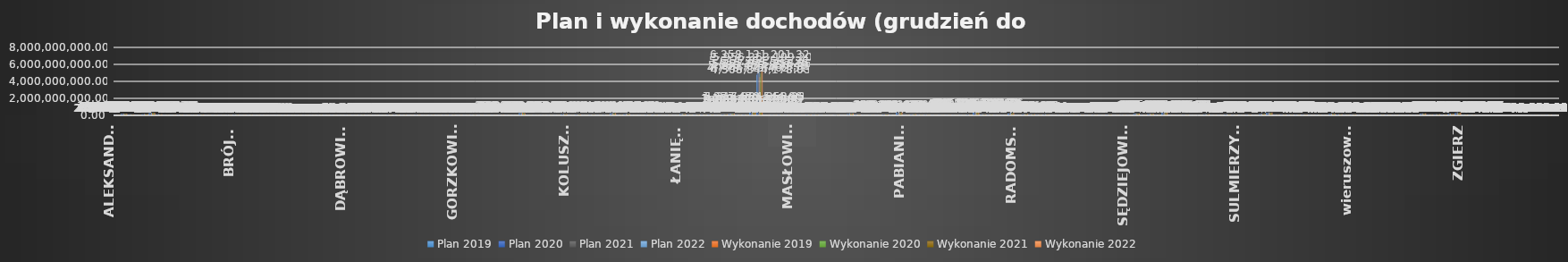
| Category | Plan 2019 | Plan 2020 | Plan 2021 | Plan 2022 | Wykonanie 2019 | Wykonanie 2020 | Series 2 | Series 3 | Series 6 | Series 7 | Wykonanie 2021 | Series 10 | Series 11 | Wykonanie 2022 |
|---|---|---|---|---|---|---|---|---|---|---|---|---|---|---|
| ALEKSANDRÓW | 24478270.41 | 24283173.98 | 27537382.62 | 32676022.12 | 24137583.58 | 24066873.37 |  |  |  |  | 25552603.27 |  |  | 28708478.08 |
| ALEKSANDRÓW ŁÓDZKI | 168029814.01 | 180178053.6 | 197245616.08 | 219583583.02 | 157289257.9 | 178610650.74 |  |  |  |  | 182521813.01 |  |  | 197213521.85 |
| ANDRESPOL | 72992338.95 | 78912447.79 | 90080146.39 | 125184037.34 | 72980919.13 | 78663948.52 |  |  |  |  | 78773892.19 |  |  | 112485549.13 |
| BEDLNO | 23144149.45 | 27233313.84 | 35072441.68 | 50634232.06 | 23278445.34 | 26307018.49 |  |  |  |  | 29071427.36 |  |  | 42759766.91 |
| bełchatowski | 131222097 | 133661317 | 141559567 | 161112251 | 131248424.61 | 132177891.32 |  |  |  |  | 136943414.59 |  |  | 151251469.93 |
| BEŁCHATÓW | 270902017.24 | 288220387.32 | 314438524.58 | 306308675.43 | 273094212.62 | 290809945.13 |  |  |  |  | 307808002.97 |  |  | 299950684.46 |
| BEŁCHATÓW | 59952992.67 | 61840947.8 | 81046335.77 | 156033262.29 | 60844834.63 | 63258396.24 |  |  |  |  | 74722805.64 |  |  | 135560681.76 |
| BĘDKÓW | 15164769.42 | 17043086.99 | 19072343.44 | 26302219.78 | 14996434.49 | 16683513.2 |  |  |  |  | 17406313.6 |  |  | 23356375.4 |
| BIAŁA | 24003889.06 | 31385929.56 | 36113319.29 | 45841363.47 | 23905240.09 | 31261073.66 |  |  |  |  | 33957840.69 |  |  | 42199553.38 |
| BIAŁA RAWSKA | 58830758.71 | 59863821.91 | 68490581.93 | 89918024.73 | 59508470.24 | 59772995.2 |  |  |  |  | 64713093.93 |  |  | 83390328.24 |
| BIAŁACZÓW | 27159815.57 | 30555957.88 | 38440593.59 | 51104979.43 | 27525163 | 30753871.23 |  |  |  |  | 34094807.98 |  |  | 45102223.98 |
| BIELAWY | 25648161.41 | 28711476.21 | 32500070.28 | 40616334.34 | 25673719.95 | 28228588.1 |  |  |  |  | 27286196.34 |  |  | 38277179.95 |
| BŁASZKI | 66904773.67 | 74040650.69 | 79127086.33 | 115109392.75 | 65137660.85 | 72879891.24 |  |  |  |  | 75646966.87 |  |  | 106016785.26 |
| BOLESŁAWIEC | 19653636.41 | 20783357.15 | 21973910.8 | 25908922.83 | 19489773.91 | 21157952.69 |  |  |  |  | 21080015.65 |  |  | 24687075.83 |
| BOLIMÓW | 19980651.82 | 26064648.91 | 27629882.99 | 34502399.81 | 20055364.42 | 23843984.79 |  |  |  |  | 25382657.86 |  |  | 32285854.58 |
| BRĄSZEWICE | 25039448.67 | 27307325.32 | 32366126.06 | 40622897.66 | 24281333.12 | 26641267.42 |  |  |  |  | 28276403.8 |  |  | 34154245.23 |
| BRÓJCE | 33714872.86 | 37951665.97 | 43238002.21 | 53748642.63 | 33776912.83 | 37444910.64 |  |  |  |  | 40928506.51 |  |  | 49536671.35 |
| BRZEZINY | 56949157.07 | 72616715.72 | 67478325.36 | 102360496.77 | 56679379.27 | 69434389.27 |  |  |  |  | 61181819.85 |  |  | 91568777.55 |
| BRZEZINY | 28054028.68 | 28326717.47 | 38834396.7 | 51311495.21 | 29964067.42 | 29372321.23 |  |  |  |  | 28178670.44 |  |  | 40145497.64 |
| brzeziński | 36354351 | 38359205.15 | 44744721.39 | 70852751.89 | 36519977.33 | 37796640.87 |  |  |  |  | 41888239.42 |  |  | 62854629.92 |
| BRZEŹNIO | 31655598.01 | 32248112.37 | 34900839.52 | 48944546.85 | 30374623.38 | 31025936.34 |  |  |  |  | 29221612.82 |  |  | 44866727.68 |
| BUCZEK | 27696995.15 | 25941760.67 | 31670341.16 | 38682894.52 | 28137650.45 | 25639516.06 |  |  |  |  | 28278541.18 |  |  | 34454421.11 |
| BUDZISZEWICE | 13113082.88 | 12364997.08 | 16077009.12 | 24380467.44 | 13066361.89 | 11566737.52 |  |  |  |  | 11549956.95 |  |  | 20535194.05 |
| BURZENIN | 27125742.5 | 30157791.76 | 35003161.13 | 41342289.01 | 27834031.99 | 29765797.48 |  |  |  |  | 32498789.75 |  |  | 38718100.55 |
| CHĄŚNO | 14737366.86 | 16167667.72 | 17525907.51 | 30045296.23 | 14660428.31 | 15950442.31 |  |  |  |  | 15102007.93 |  |  | 27019755.94 |
| CIELĄDZ | 19732140.86 | 22118666.93 | 24635181.72 | 32826627.98 | 19690969.65 | 22001855.24 |  |  |  |  | 22645870.24 |  |  | 30628110.13 |
| CZARNOCIN | 22019593.65 | 24333471.56 | 28782305.28 | 35122950.02 | 22285692.71 | 24825490.44 |  |  |  |  | 26718774.42 |  |  | 31438999.23 |
| CZARNOŻYŁY | 22686427.39 | 20566041.84 | 25746532.51 | 38645056.16 | 22943784.49 | 20437799.72 |  |  |  |  | 23442248.06 |  |  | 34277752.29 |
| CZASTARY | 18266585.93 | 20191797.52 | 23106530.25 | 35475610.71 | 18156844.62 | 19966970.04 |  |  |  |  | 22301599.66 |  |  | 34574622.35 |
| CZERNIEWICE | 28805836.21 | 31739983.19 | 44058386.87 | 35665433.58 | 28834780.49 | 31874917.51 |  |  |  |  | 41733832.56 |  |  | 32821353.98 |
| DALIKÓW | 26509326.98 | 25715308.72 | 28646546.57 | 37084309.65 | 26550279.42 | 26434715.23 |  |  |  |  | 27248602.95 |  |  | 33812253.68 |
| DASZYNA | 38311825.83 | 41217931.77 | 38061515.95 | 41560198.67 | 36522989.11 | 28391948.92 |  |  |  |  | 32911512.58 |  |  | 33560621.59 |
| DĄBROWICE | 11311305.78 | 14062063.66 | 14213797.06 | 21808241.16 | 10055987.63 | 16076353.88 |  |  |  |  | 12534206.88 |  |  | 16848276.67 |
| DŁUTÓW | 24655217.97 | 25768925.72 | 28337445.67 | 40596974.88 | 24573849.2 | 25639884.28 |  |  |  |  | 25166020.08 |  |  | 35055383.93 |
| DMOSIN | 24005576.42 | 24026281.73 | 25286172.57 | 43207905.97 | 24047276.69 | 23859035.84 |  |  |  |  | 24210010.83 |  |  | 37670531.16 |
| DOBROŃ | 38595644.76 | 44429007.53 | 45111481.03 | 60265048.14 | 38290053.36 | 44952020.33 |  |  |  |  | 41260078.05 |  |  | 56984576.37 |
| DOBRYSZYCE | 21359396.11 | 24065433.68 | 33290728.68 | 38656803.73 | 21351473.02 | 23759063.76 |  |  |  |  | 31100191.46 |  |  | 35972038.73 |
| DOMANIEWICE | 22582968.87 | 23633191.61 | 29313501.24 | 34881418.6 | 22850597.64 | 23952385.47 |  |  |  |  | 26743547.38 |  |  | 31365813.36 |
| DRUŻBICE | 25840515.82 | 30362930.89 | 31164994.43 | 42654845.71 | 25837789.56 | 29984782.1 |  |  |  |  | 30102024.31 |  |  | 39111677.21 |
| DRZEWICA | 48457168.33 | 50401829.04 | 59624582.17 | 64890265.21 | 48287719.66 | 49969854.17 |  |  |  |  | 50963957.14 |  |  | 59945372.27 |
| DZIAŁOSZYN | 61594206 | 66618656.37 | 71559601.74 | 94427409.02 | 61268463.44 | 67523689.83 |  |  |  |  | 68472309.71 |  |  | 88622582.76 |
| GALEWICE | 30005028.89 | 34749706.01 | 44974858.44 | 48278997.4 | 29617337.24 | 34485670.7 |  |  |  |  | 41547928.6 |  |  | 42946461.08 |
| GIDLE | 29841799.36 | 29816534.07 | 35729668 | 46037401.31 | 29788754.4 | 29902982.66 |  |  |  |  | 31620453.79 |  |  | 43623621.45 |
| GŁOWNO | 57894363.89 | 65336933.7 | 70849016.62 | 87491331.68 | 58521181.48 | 64049248.64 |  |  |  |  | 67088444.12 |  |  | 81637019.57 |
| GŁOWNO | 22571720.4 | 27052714.57 | 27937077.39 | 34217369.88 | 22953604.58 | 24728441.74 |  |  |  |  | 24542247.11 |  |  | 31976237.83 |
| GŁUCHÓW | 27023388.51 | 34461084.59 | 47543600.23 | 52178966.26 | 30964036.79 | 32922737.61 |  |  |  |  | 41204355.54 |  |  | 48323683.44 |
| GODZIANÓW | 13713014.86 | 18320556.31 | 21460508.43 | 20710727.63 | 13725449.62 | 18083270.16 |  |  |  |  | 19920757.63 |  |  | 19325210.04 |
| GOMUNICE | 29122829.57 | 33382471.09 | 41099279.76 | 42907753.4 | 28788680.17 | 32067919.1 |  |  |  |  | 38992732.68 |  |  | 41374263.62 |
| GORZKOWICE | 40770209.31 | 43597611.01 | 52103713 | 64342641.28 | 40149424.97 | 42552933.17 |  |  |  |  | 46946237.23 |  |  | 55638984.9 |
| GOSZCZANÓW | 28476656.65 | 28610349.6 | 31056552.7 | 51863014.52 | 28465170.65 | 27751825.89 |  |  |  |  | 29184353.36 |  |  | 44778869.19 |
| GÓRA ŚW. MAŁGORZATY | 20569937.51 | 23818156.1 | 25206962.94 | 28462964.01 | 20870068.55 | 23693145.31 |  |  |  |  | 23896082.26 |  |  | 25859695.74 |
| GRABICA | 37307131.57 | 40873255.58 | 44320246.59 | 62129300.87 | 36631809.03 | 39544917.27 |  |  |  |  | 37230631.93 |  |  | 53056366.3 |
| GRABÓW | 26760153.23 | 30347231.94 | 31343144.82 | 50261655.09 | 26864962.12 | 29865470.18 |  |  |  |  | 29310837.59 |  |  | 47773899.05 |
| INOWŁÓDZ | 23905734.12 | 28906834.27 | 30555015.79 | 34747109.57 | 23644417.49 | 28921138.41 |  |  |  |  | 27683105.52 |  |  | 30998262.95 |
| JEŻÓW | 17150908.77 | 19123863.1 | 20370032.28 | 32953406.12 | 16870463.39 | 18863247.47 |  |  |  |  | 19161791.66 |  |  | 28992951.89 |
| KAMIEŃSK | 36784074.51 | 38303504.72 | 65320908.27 | 81389743.78 | 40916811.61 | 38663375.87 |  |  |  |  | 60204311.6 |  |  | 73883097.66 |
| KIEŁCZYGŁÓW | 20004074.82 | 20049475.78 | 23566605.62 | 31636663.59 | 19525924.41 | 19511704.73 |  |  |  |  | 21054796.34 |  |  | 28888038.75 |
| KIERNOZIA | 18519213.73 | 20173733.28 | 22920908.21 | 36047183.18 | 18481702.59 | 19701061.78 |  |  |  |  | 21403970.71 |  |  | 32120866.56 |
| KLESZCZÓW | 284061698.25 | 276230061.33 | 319086597.23 | 264558104.64 | 286250523.74 | 261248951.51 |  |  |  |  | 283739353.34 |  |  | 243888719.74 |
| KLONOWA | 14596699.92 | 18004648.55 | 17896454.59 | 24044622.63 | 14643767.17 | 17826643.83 |  |  |  |  | 17196008.99 |  |  | 23339132.74 |
| KLUKI | 20981698.99 | 22560305.26 | 25824988.94 | 37815164.92 | 20897375.1 | 21978508.67 |  |  |  |  | 24177628.29 |  |  | 30563392.33 |
| KOBIELE WIELKIE | 19926713 | 21905205.06 | 22775961.98 | 28665080.48 | 19867927.37 | 21709292.15 |  |  |  |  | 21614837.63 |  |  | 27047499.65 |
| KOCIERZEW POŁUDNIOWY | 19698283.63 | 22386394 | 24472403.15 | 41330748.71 | 19235223.1 | 22233137.74 |  |  |  |  | 21329987.82 |  |  | 37583267.19 |
| KODRĄB | 21560362.8 | 22514653.04 | 28983222.26 | 28057060.63 | 22356377.06 | 22208448.25 |  |  |  |  | 27030793.05 |  |  | 26356199.08 |
| KOLUSZKI | 131161303.72 | 131953610.5 | 142047810.7 | 168711933.94 | 123531930.79 | 125292687.73 |  |  |  |  | 130648851.25 |  |  | 153547422.27 |
| KONOPNICA | 21063947.67 | 20513754.86 | 25042144.83 | 32610489 | 21014926.93 | 20363192.58 |  |  |  |  | 24029447.62 |  |  | 29673755.44 |
| KONSTANTYNÓW ŁÓDZKI | 86168332 | 95209453.74 | 107783879.27 | 113736142.45 | 85136053.12 | 93146943.75 |  |  |  |  | 100875135.15 |  |  | 102531815.83 |
| KOWIESY | 14559469.52 | 17544629.84 | 19704630.86 | 25920787.44 | 14625919.55 | 17406283.04 |  |  |  |  | 18274393.62 |  |  | 24285818.75 |
| KROŚNIEWICE | 42278850.62 | 42085142.92 | 48763096.4 | 66147326.85 | 42546199.08 | 41923035.7 |  |  |  |  | 46309503.97 |  |  | 60882603.66 |
| KRZYŻANÓW | 23320376.46 | 23716554.83 | 27165664.25 | 44822579.84 | 23254220.47 | 24165507.73 |  |  |  |  | 18264759.51 |  |  | 39456568.52 |
| KSAWERÓW | 47375994.86 | 54137935.71 | 68715666.78 | 68005502.98 | 46984543.76 | 53861774.74 |  |  |  |  | 61862639.47 |  |  | 53309263.76 |
| KUTNO | 222323499.98 | 256693393.17 | 261822461.04 | 288396156.21 | 210941836.08 | 243406569.14 |  |  |  |  | 243456058.77 |  |  | 264160015.39 |
| KUTNO | 39551469.68 | 45397825.21 | 52685289.34 | 62315524.63 | 40109516.13 | 45289992.69 |  |  |  |  | 50396086.61 |  |  | 58008710.09 |
| kutnowski | 129479013.35 | 137448119.42 | 150318951.38 | 178947427.06 | 127751798.65 | 135761631.07 |  |  |  |  | 142073893.72 |  |  | 163590810.48 |
| LGOTA WIELKA | 24333429.51 | 26311550.87 | 31196506.76 | 35401589.62 | 24054985.38 | 25732552.89 |  |  |  |  | 28944410.39 |  |  | 30591051.36 |
| LIPCE REYMONTOWSKIE | 17993130.92 | 22115332.6 | 30790805.33 | 28124378.58 | 17413015.97 | 20305604.86 |  |  |  |  | 21504963.61 |  |  | 23416117.53 |
| LUBOCHNIA | 45048772.17 | 53147420.65 | 50654835.78 | 56923266.48 | 44870392.95 | 52555288.88 |  |  |  |  | 46161294.73 |  |  | 50224092.21 |
| LUTOMIERSK | 41337563.18 | 45571643.39 | 57304580.86 | 66150984.67 | 41405902.42 | 45068352.23 |  |  |  |  | 45159200.89 |  |  | 52600423.54 |
| LUTUTÓW | 23649901.9 | 25334382.23 | 32853704.3 | 42839036.07 | 24394415.01 | 25242080.96 |  |  |  |  | 27974736.35 |  |  | 38671490.65 |
| ŁADZICE | 24443671.65 | 24498291.38 | 25091807.99 | 35369615.72 | 25410056 | 24406431.2 |  |  |  |  | 23665861.94 |  |  | 31749804.77 |
| ŁANIĘTA | 11853894.27 | 13939194.1 | 18034303.08 | 34989213.46 | 11501528.25 | 13242213.9 |  |  |  |  | 14916987.73 |  |  | 16198280.73 |
| ŁASK | 121839835.37 | 125129776.83 | 141849644.65 | 171490513.43 | 122719832.74 | 123064319.66 |  |  |  |  | 133662132.62 |  |  | 153343281.47 |
| łaski | 52551322.4 | 50489721.05 | 65032075.6 | 67764002.14 | 53407392.79 | 50610086.52 |  |  |  |  | 58132326.75 |  |  | 56991344.57 |
| ŁĘCZYCA | 70207827.45 | 72288233.97 | 78502451.6 | 78976814.46 | 69846612.11 | 71864741.13 |  |  |  |  | 74717961.29 |  |  | 71950751.99 |
| ŁĘCZYCA | 41768725.81 | 52724606.05 | 52719332.33 | 64124242.29 | 42195366.97 | 48519153.79 |  |  |  |  | 43142216.16 |  |  | 55407110.92 |
| łęczycki | 63011896.95 | 67965211.51 | 75675273.39 | 86321142.41 | 61904875.86 | 65989096.08 |  |  |  |  | 70142241.54 |  |  | 79955019.12 |
| ŁĘKI SZLACHECKIE | 15865437.66 | 19058658.7 | 19590138.18 | 29795429.51 | 15288042.43 | 18277286.37 |  |  |  |  | 17888563.7 |  |  | 25606918.66 |
| łowicki | 96317424.65 | 103361567.03 | 124401838.45 | 144572914.45 | 95569342.21 | 100850796.05 |  |  |  |  | 104332796.16 |  |  | 126174683.27 |
| ŁOWICZ | 140555765.51 | 178930916.72 | 183744635.43 | 200099497.02 | 141129621.27 | 177879300.05 |  |  |  |  | 165382672.6 |  |  | 182573898.22 |
| ŁOWICZ | 42123257.83 | 45178932.43 | 48172430.86 | 60691099.62 | 41612438.78 | 44789882.13 |  |  |  |  | 42132513.52 |  |  | 55628150.88 |
| łódzki wschodni | 67546055.45 | 78161635.58 | 85616408.23 | 111232405.49 | 66792094.86 | 78291553.81 |  |  |  |  | 74158652.23 |  |  | 95349740.55 |
| łódzkie | 992227047 | 1093106329 | 1169420446 | 1377470544 | 986665667.95 | 1097732100.67 |  |  |  |  | 1066808157.47 |  |  | 1317884253.33 |
| Łódź | 4778775462.51 | 5086453850.49 | 5614364585.36 | 6358131201.32 | 4508844178.03 | 4921024478.31 |  |  |  |  | 5227945218.36 |  |  | 5956363199.2 |
| ŁUBNICE | 19944958.97 | 23788023.48 | 22514808.1 | 27048950.14 | 19864106.74 | 23307147.67 |  |  |  |  | 21282501.22 |  |  | 24816974.87 |
| ŁYSZKOWICE | 30378589.28 | 33693201.03 | 44118945.72 | 46177801.93 | 30802087.29 | 32825546.35 |  |  |  |  | 34856631.91 |  |  | 40737196.9 |
| MAKÓW | 36416981.92 | 42441604 | 43279521.42 | 45434902.12 | 35318091.76 | 42565994.87 |  |  |  |  | 38283322.08 |  |  | 37608972.2 |
| MASŁOWICE | 21236282.61 | 25237995.34 | 24311200.79 | 32265154.7 | 21026476.13 | 25199037.02 |  |  |  |  | 21888490.52 |  |  | 30345281.44 |
| MNISZKÓW | 23471461.59 | 27097370.92 | 30115663.17 | 34656832.64 | 22696068.67 | 25375369.05 |  |  |  |  | 27553355.77 |  |  | 31899362.88 |
| MOKRSKO | 25543999.4 | 30013239.49 | 32906588.02 | 44437800.45 | 25505796.89 | 29796298.2 |  |  |  |  | 31670346.24 |  |  | 41161700.25 |
| MOSZCZENICA | 64871632.45 | 74066374.8 | 89943779.24 | 106232809.27 | 63098505.7 | 70088864.8 |  |  |  |  | 81898159.03 |  |  | 100886351.98 |
| NIEBORÓW | 45141051.78 | 47220602.53 | 53988597.06 | 69113891.43 | 44969815.24 | 47422279.58 |  |  |  |  | 51021889.43 |  |  | 61636236.66 |
| NOWA BRZEŹNICA | 22645631.42 | 23606799.49 | 31555380.71 | 46937694.91 | 22173192.74 | 23965597.91 |  |  |  |  | 25015368.3 |  |  | 28971339.05 |
| NOWE OSTROWY | 18675295.35 | 19745738.73 | 20563516.45 | 38436239.36 | 17120805.67 | 19635398.9 |  |  |  |  | 18782828.52 |  |  | 32943629.83 |
| NOWOSOLNA | 31494184.29 | 36942608.31 | 46879089.08 | 50478411.32 | 32285596.92 | 36898176.41 |  |  |  |  | 42415663.76 |  |  | 46946264.35 |
| NOWY KAWĘCZYN | 16257082.56 | 18740131.52 | 20890186.98 | 24333848.62 | 16473970.79 | 18446475.55 |  |  |  |  | 20294733.94 |  |  | 23688596.29 |
| OPOCZNO | 152097651.42 | 164629247.4 | 232493883.17 | 239716134.18 | 152539918.53 | 159538774.09 |  |  |  |  | 209072247.7 |  |  | 215124129.79 |
| opoczyński | 82823029 | 90522778.04 | 102578670.24 | 114489934.2 | 82277505.5 | 90233606.18 |  |  |  |  | 92852810.52 |  |  | 103924350.69 |
| OPORÓW | 13157041.14 | 14350337.82 | 13986339.58 | 18196106.84 | 13014489.93 | 14073590.4 |  |  |  |  | 12917037.55 |  |  | 13692041.29 |
| OSJAKÓW | 28329240.46 | 29376791.63 | 34755238 | 48392845.88 | 26563701.99 | 29788035.24 |  |  |  |  | 30562549.73 |  |  | 41138486.75 |
| OSTRÓWEK | 21649110.27 | 23541716.99 | 27263291.26 | 46412338.4 | 21836411.42 | 23706634.78 |  |  |  |  | 25911056.99 |  |  | 42786629.4 |
| OZORKÓW | 95440295.04 | 109522525.26 | 104986096.65 | 113178093.56 | 99432505.62 | 100009924.23 |  |  |  |  | 98933568.12 |  |  | 107389908.87 |
| OZORKÓW | 35118682.72 | 37772163.91 | 40086772.33 | 48692870.32 | 32809700.52 | 37888933.55 |  |  |  |  | 36012177.69 |  |  | 44672124.05 |
| PABIANICE | 314723044.01 | 348941828.43 | 386361621.85 | 427451679.18 | 298625502.26 | 310008592.28 |  |  |  |  | 363783090.68 |  |  | 403262079.31 |
| PABIANICE | 48373098.31 | 54161354.08 | 63834593.06 | 69228361.01 | 47730702.66 | 53513339.74 |  |  |  |  | 56678267.6 |  |  | 62545519.37 |
| pabianicki | 112825341.63 | 119838375.67 | 131717347.9 | 142774789.37 | 117328581.08 | 119607623.62 |  |  |  |  | 122342492.31 |  |  | 135042833.95 |
| pajęczański | 51524759.96 | 48737738.62 | 59170100.96 | 65019510.02 | 51987434.84 | 48697811.1 |  |  |  |  | 54909468.95 |  |  | 62137660.32 |
| PAJĘCZNO | 52284372.72 | 59569446.3 | 69674624.95 | 80566288.18 | 52145531.61 | 59242929.17 |  |  |  |  | 59724661.55 |  |  | 70549619.69 |
| PARADYŻ | 25964126.53 | 34730239.39 | 31321296.68 | 40083051.27 | 26062901.26 | 34200023.11 |  |  |  |  | 30327367.76 |  |  | 39037608.33 |
| PARZĘCZEW | 27893217.67 | 29312322.32 | 29642834.04 | 48684394.47 | 26722108.67 | 29541009.6 |  |  |  |  | 28250809.96 |  |  | 39712575.01 |
| PĄTNÓW | 34285679.49 | 33191742.22 | 35224112.53 | 50450862.83 | 33956353.45 | 33127115.93 |  |  |  |  | 30900563.3 |  |  | 45336155.05 |
| PĘCZNIEW | 21125359.16 | 19359975.7 | 21567689.48 | 32119621.23 | 20486368.66 | 18470787.71 |  |  |  |  | 20603678.6 |  |  | 30229524.9 |
| PIĄTEK | 28338966.27 | 33725192 | 34405285.88 | 45082089.9 | 29196008.28 | 32951471.02 |  |  |  |  | 32379410.94 |  |  | 42298931.19 |
| piotrkowski | 86229132.92 | 81335972.71 | 103617182.25 | 111533219.65 | 88082640.98 | 80639996.71 |  |  |  |  | 90751395.52 |  |  | 104282078.77 |
| Piotrków Trybunalski | 489117021.21 | 521891117.52 | 556309185.54 | 610523799.52 | 498078172.63 | 525491848.42 |  |  |  |  | 530366027.73 |  |  | 585348302.56 |
| PODDĘBICE | 85809109.12 | 101924644.23 | 85513197.25 | 120238753.29 | 86248989.47 | 102104081.36 |  |  |  |  | 77970654.62 |  |  | 103421577.85 |
| poddębicki | 45686718.71 | 48738714.67 | 54853645.31 | 65657661.76 | 46014755.87 | 47872273.97 |  |  |  |  | 48067149.1 |  |  | 59477487.1 |
| POŚWIĘTNE | 16000912.91 | 15859875.94 | 17430084.51 | 26474705.29 | 16059035.69 | 15904629.06 |  |  |  |  | 15709392.73 |  |  | 24165299.09 |
| PRZEDBÓRZ | 37055318.15 | 38192131.07 | 38119910.59 | 51744859.94 | 36850194.92 | 37766024.92 |  |  |  |  | 37015537.67 |  |  | 49048138.4 |
| RADOMSKO | 223172207.35 | 234266117.63 | 278681125.22 | 307282459.08 | 217837370.64 | 246109867.85 |  |  |  |  | 253382346 |  |  | 281496806.37 |
| RADOMSKO | 27518398.75 | 30081395.11 | 39139525.58 | 46151841.5 | 27736010.7 | 29585172.15 |  |  |  |  | 35726319.24 |  |  | 41987396.78 |
| radomszczański | 118419131.5 | 128057773.27 | 141777979.36 | 166568346.91 | 119914038.8 | 126823306.21 |  |  |  |  | 130181952.14 |  |  | 153991842.24 |
| RAWA MAZOWIECKA | 95891132.85 | 109161339.48 | 130063395.11 | 133486738.97 | 93612080.17 | 101915466.5 |  |  |  |  | 112391532.18 |  |  | 125464919 |
| RAWA MAZOWIECKA | 44941276.5 | 46864264.81 | 56689396.77 | 75138334.98 | 44809815.05 | 49726975.58 |  |  |  |  | 52641760.03 |  |  | 67710756.45 |
| rawski | 73669716 | 71216613 | 92127572 | 123320605.88 | 76291812.57 | 67858236.61 |  |  |  |  | 84685349.09 |  |  | 112792282.8 |
| REGNÓW | 8990256.6 | 9844929.44 | 11017166.87 | 20369737.36 | 9031623.02 | 9644619.13 |  |  |  |  | 9914039.5 |  |  | 19169054.49 |
| RĘCZNO | 16461766.99 | 17326611.9 | 19784877.85 | 23065031.47 | 16397699.67 | 16989600.87 |  |  |  |  | 17879454.07 |  |  | 20818212.95 |
| ROGÓW | 24912000 | 24680257.05 | 28950776.81 | 38677987.15 | 25239779.53 | 24691297.45 |  |  |  |  | 27646495.31 |  |  | 35394804.69 |
| ROKICINY | 32068992.28 | 33960680.67 | 38816735.2 | 47684952.73 | 32093157.97 | 34352945.63 |  |  |  |  | 33991633.48 |  |  | 42319623.3 |
| ROZPRZA | 58604622.89 | 63114927.89 | 76140519.61 | 83194483.27 | 58346242.02 | 62047857.48 |  |  |  |  | 70156251.07 |  |  | 73816174.96 |
| RUSIEC | 24226768 | 25990000 | 29650000 | 46252126.78 | 24217859.17 | 26124303.65 |  |  |  |  | 28892072.4 |  |  | 44815445.2 |
| RZĄŚNIA | 56759674.73 | 55010143.96 | 74588539.16 | 71859790.21 | 62525575.75 | 55430090.57 |  |  |  |  | 62324192.14 |  |  | 62095348.99 |
| RZECZYCA | 30617396 | 34943230 | 34626085 | 53079422 | 30494033.58 | 28308183.8 |  |  |  |  | 27759404.48 |  |  | 42092800.19 |
| RZGÓW | 80887860.96 | 77466285.11 | 81117846.58 | 97931277.62 | 81672328.13 | 81356742.57 |  |  |  |  | 72088649.74 |  |  | 87406766.37 |
| SADKOWICE | 26419093.84 | 29357261.59 | 31619571.48 | 46177615.94 | 26332196.54 | 29247799.38 |  |  |  |  | 29370404.53 |  |  | 40191450.9 |
| SĘDZIEJOWICE | 32313519.08 | 36116778.09 | 42921591.72 | 48975022.73 | 30076035.16 | 35220719.72 |  |  |  |  | 41180664.95 |  |  | 45526328.33 |
| SIEMKOWICE | 24998222.59 | 26525670.81 | 28225666.76 | 35855802.63 | 25621536.09 | 26245508.06 |  |  |  |  | 27149247.46 |  |  | 33664668.7 |
| SIERADZ | 181613371.31 | 197560148.97 | 225804851.07 | 242975998.37 | 183455244.73 | 196631465.5 |  |  |  |  | 209466421.72 |  |  | 221904035.99 |
| SIERADZ | 49412374.52 | 59182897.11 | 64676023.78 | 84495724.34 | 48504076.15 | 58271054.84 |  |  |  |  | 60382132.41 |  |  | 75679576.21 |
| sieradzki | 153016333.22 | 164729581.06 | 170901099.92 | 190914964.56 | 146775233.25 | 162522709.06 |  |  |  |  | 160833829.42 |  |  | 174596109.45 |
| SKIERNIEWICE | 41291532.77 | 50519533.02 | 54583769.72 | 68477605.75 | 39615832.16 | 49340048.23 |  |  |  |  | 51726249.28 |  |  | 61176003.49 |
| SKIERNIEWICE | 302121579.83 | 367069537.74 | 395302403.66 | 469199816.68 | 300907904.68 | 361812640.29 |  |  |  |  | 375297682.4 |  |  | 425938386.54 |
| skierniewicki | 29028498 | 31473192 | 30958352 | 58056753.52 | 28970531.18 | 30696078.38 |  |  |  |  | 28856125.53 |  |  | 52172090.55 |
| SKOMLIN | 16235248.38 | 20520966.43 | 23425663.19 | 26246815.29 | 15558137.36 | 19318437.75 |  |  |  |  | 20165639.77 |  |  | 22228852.32 |
| SŁAWNO | 45100505.02 | 41867622.9 | 43589298.78 | 53283006 | 45017245.21 | 41933138.49 |  |  |  |  | 41614194.25 |  |  | 51318160.01 |
| SŁUPIA | 13746826.19 | 14162241.98 | 14275928.7 | 20687840.38 | 12586348.16 | 13502021.12 |  |  |  |  | 12602824.01 |  |  | 17374332.66 |
| SOKOLNIKI | 30746143.2 | 29253321.19 | 32656659.26 | 43728465.1 | 30093213.97 | 29957149.06 |  |  |  |  | 26692034.96 |  |  | 39106594.79 |
| STRYKÓW | 95483070.98 | 109127890.86 | 119798354.74 | 145224402.18 | 99882237.02 | 110828795.4 |  |  |  |  | 109346827.04 |  |  | 118913704.66 |
| STRZELCE | 18687292.74 | 26633273.75 | 27323522.9 | 35275082.18 | 18071273.69 | 26202567.06 |  |  |  |  | 21980531.21 |  |  | 29796181.95 |
| STRZELCE WIELKIE | 24169041.53 | 23400288.97 | 27170308.67 | 37088837.68 | 22802599.52 | 22785731.08 |  |  |  |  | 24893560.51 |  |  | 34552211.12 |
| SULEJÓW | 92514357.8 | 89196985.04 | 116468403.62 | 128915528.53 | 80855710.65 | 88884202.77 |  |  |  |  | 106052987.33 |  |  | 111264642.8 |
| SULMIERZYCE | 42416903.24 | 50308706.23 | 62481960.09 | 100317268.89 | 42063868.77 | 51106639.31 |  |  |  |  | 54965278.2 |  |  | 88808246.35 |
| SZADEK | 34964806.95 | 36200477.33 | 41230601.05 | 50854845 | 34881748.74 | 35745427.34 |  |  |  |  | 38620771.79 |  |  | 47709744.74 |
| SZCZERCÓW | 74761982.82 | 85512766.29 | 83539869.04 | 105911234.05 | 74612809.57 | 86016577.67 |  |  |  |  | 73827886.49 |  |  | 91380638.19 |
| ŚWINICE WARCKIE | 19747129.79 | 20247219.44 | 21116352.01 | 27745146.55 | 18600666.69 | 22290653.92 |  |  |  |  | 19855629.57 |  |  | 25226033.94 |
| tomaszowski | 131827258.5 | 159858694.96 | 188086707.07 | 176127169.65 | 131293330.12 | 157639606.32 |  |  |  |  | 182476631.6 |  |  | 170937406.63 |
| TOMASZÓW MAZOWIECKI | 299858435.8 | 314158755.63 | 312691046.73 | 355954890.58 | 301583925.07 | 313400574.8 |  |  |  |  | 302593791.13 |  |  | 342266162.3 |
| TOMASZÓW MAZOWIECKI | 65047009.21 | 70227401.5 | 73523981.05 | 88763002.19 | 67203096.28 | 67178983.79 |  |  |  |  | 68046133.95 |  |  | 79264514.69 |
| TUSZYN | 66223385.29 | 75480276.4 | 85327568.93 | 91292400.36 | 66242941.4 | 71821417.24 |  |  |  |  | 72141068.36 |  |  | 80972565.59 |
| UJAZD | 45566622.95 | 54220799.03 | 67632972.92 | 78973440.03 | 47582631.92 | 54628191.61 |  |  |  |  | 64172297.51 |  |  | 74431076.42 |
| UNIEJÓW | 70740195.1 | 57822273.82 | 89787939.65 | 108075757.81 | 64209970.22 | 55903858.31 |  |  |  |  | 73287449.57 |  |  | 78431129.62 |
| WARTA | 70007989.95 | 67109474.2 | 73805405.82 | 107278512.52 | 70720273.8 | 66038917.67 |  |  |  |  | 66543814.77 |  |  | 101103872.21 |
| WARTKOWICE | 36649409.06 | 40920761.86 | 45648237.98 | 65851324.48 | 36198085.57 | 38853676.75 |  |  |  |  | 37730950.34 |  |  | 54939094.19 |
| WIDAWA | 38625157.32 | 41680994.78 | 43163671.19 | 62560899.71 | 36778913.47 | 40111234.97 |  |  |  |  | 39899410.84 |  |  | 52162370.73 |
| WIELGOMŁYNY | 21936886.62 | 23622444.14 | 25763533.6 | 37607054.8 | 21806309.13 | 24317534 |  |  |  |  | 24350066.37 |  |  | 34533133.53 |
| WIELUŃ | 145895024.4 | 155805708.79 | 189168354.43 | 185170822.22 | 145504475.52 | 156240511.04 |  |  |  |  | 160834752.87 |  |  | 168513010.41 |
| wieluński | 102093500.63 | 103922499.83 | 117495984.16 | 140331773.58 | 100592211.11 | 103283944.7 |  |  |  |  | 107820373.12 |  |  | 134178248.99 |
| wieruszowski | 46723516 | 60779750 | 59609021 | 63648863.79 | 46685920.59 | 60362482.63 |  |  |  |  | 57036791.55 |  |  | 60088424.22 |
| WIERUSZÓW | 72397920.4 | 77170591.67 | 88503022.88 | 102405168.83 | 72603129.94 | 73721663.06 |  |  |  |  | 83795674.19 |  |  | 92788494.06 |
| WIERZCHLAS | 40721187.8 | 36798992.15 | 46995584.26 | 52752502.09 | 39180341.03 | 34562270.88 |  |  |  |  | 39413004.2 |  |  | 45330773.56 |
| WITONIA | 15411515.01 | 16808828.4 | 20733222.15 | 29566747.97 | 14493370.38 | 15518299.33 |  |  |  |  | 17427715.21 |  |  | 23985572.03 |
| WODZIERADY | 18598875.51 | 22424563.33 | 29573982.99 | 31196603.58 | 17893733.59 | 19248279.11 |  |  |  |  | 24557774.3 |  |  | 27730917.07 |
| WOLA KRZYSZTOPORSKA | 62117599.48 | 70927445.66 | 78886201.65 | 93719483.94 | 63286845.13 | 72304504.61 |  |  |  |  | 68980973.41 |  |  | 84066185.11 |
| WOLBÓRZ | 47930624.09 | 52509433.22 | 60961154.65 | 68174592.05 | 47762026.58 | 54827435.79 |  |  |  |  | 57787121.85 |  |  | 64919693.29 |
| WRÓBLEW | 27571223.01 | 34646164.13 | 33318433.17 | 54732757.51 | 27854338.72 | 34262537.26 |  |  |  |  | 29569677.05 |  |  | 45627109.53 |
| ZADZIM | 26747778.4 | 27849752.32 | 27371257.54 | 33938098.51 | 26706305.53 | 28096042.46 |  |  |  |  | 25795117.81 |  |  | 32239247.53 |
| ZAPOLICE | 28441298.05 | 29489422.89 | 31731022.91 | 39884706.49 | 26568932.32 | 28339823.5 |  |  |  |  | 27572635.87 |  |  | 33808638.23 |
| ZDUNY | 26451844.24 | 32478325.22 | 35944319.9 | 46516191.59 | 25880617.57 | 30030092.15 |  |  |  |  | 31805177.55 |  |  | 43185077.98 |
| ZDUŃSKA WOLA | 174690514.81 | 189806890.49 | 222829903.61 | 247444773.61 | 174932185.36 | 187615526.41 |  |  |  |  | 208277481.69 |  |  | 228029298.92 |
| ZDUŃSKA WOLA | 60576941.49 | 62280894.52 | 66115976.36 | 91435452.25 | 61402282.66 | 64892989.5 |  |  |  |  | 60059596.03 |  |  | 112285073.08 |
| zduńskowolski | 113461267.8 | 103252929.2 | 108813469.6 | 127989569.96 | 112324798.69 | 103928059.37 |  |  |  |  | 104724835.44 |  |  | 121025922.56 |
| ZELÓW | 70885524.76 | 72822268.52 | 80306235.73 | 111194012.23 | 71042261.71 | 72587238.53 |  |  |  |  | 74765129.9 |  |  | 101566007.37 |
| zgierski | 145396212.83 | 171977792.5 | 209449596.48 | 207498760.81 | 149140751.16 | 168597695.35 |  |  |  |  | 192020402.31 |  |  | 192865069.71 |
| ZGIERZ | 259483671.81 | 298748486.33 | 354003186.51 | 358320988.45 | 253383763.17 | 296208422.04 |  |  |  |  | 329229905.77 |  |  | 335242836.51 |
| ZGIERZ | 72250485.2 | 76587674.52 | 87388562.91 | 109455734.85 | 75073787.29 | 76971136.82 |  |  |  |  | 82439153.74 |  |  | 98540769.14 |
| ZŁOCZEW | 37228725.64 | 37854063.68 | 45952678.14 | 60742397.74 | 36952035.75 | 38113975.8 |  |  |  |  | 43174945.08 |  |  | 53853978.6 |
| Związek Gmin Nadnerzańskich | 12100 | 24000 | 49796.02 | 58635.27 | 12067.1 | 24013.35 |  |  |  |  | 15160.75 |  |  | 15283.83 |
| Związek Gmin Powiatu Radomszczańskiego w Gidlach | 26000 | 26000 | 62000 | 27762.02 | 26009.01 | 26006.55 |  |  |  |  | 46195.82 |  |  | 20538.22 |
| Związek Gmin Regionu Kutnowskiego | 770286.51 | 8493959 | 10921465.14 | 10759050.05 | 734056.78 | 589126.11 |  |  |  |  | 1880892.35 |  |  | 5941466.16 |
| Związek Gmin Regionu Poddębickiego | 7500 | 15000 | 18390.71 | 20380.11 | 7500 | 15000 |  |  |  |  | 14510.6 |  |  | 16540.25 |
| Związek Gmin Ziemi Wieluńskiej | 149793.4 | 156640.9 | 322719.4 | 347003.4 | 141236.44 | 161914.2 |  |  |  |  | 132765.55 |  |  | 291332.04 |
| Związek Komunalny Gmin w Bełchatowie | 30000 | 30000 | 78000 | 78000 | 29696.65 | 25801.16 |  |  |  |  | 66728.37 |  |  | 68380.87 |
| Związek Międzygminny "Bzura" z siedzibą w Łowiczu | 2766902.76 | 1656689.38 | 17734658.42 | 11227909.77 | 2918127.89 | 879142.22 |  |  |  |  | 1197547.36 |  |  | 1830113.62 |
| Związek Powiatów Województwa Łódzkiego z siedzibą w Piotrkowie Trybunalskim | 1697732.97 | 1955056.73 | 7417208.03 | 23401189.16 | 1742760.31 | 1911415.95 |  |  |  |  | 6003024.92 |  |  | 19736785.44 |
| ŻARNÓW | 28743964.67 | 35749453.21 | 36062984.8 | 45386739.43 | 28835044.28 | 33167637.31 |  |  |  |  | 33391614.86 |  |  | 38957554.29 |
| ŻELECHLINEK | 19783510.53 | 21671421.68 | 27800038.4 | 33549884.92 | 19473183.52 | 20780674.49 |  |  |  |  | 22667173.32 |  |  | 25652508.49 |
| ŻYCHLIN | 48950708.36 | 56068852.82 | 62147170.11 | 73310225.83 | 47312672.37 | 52858717.51 |  |  |  |  | 58886092.03 |  |  | 66626989.13 |
| ŻYTNO | 24051579.78 | 27638061.2 | 30086059.1 | 46833649.15 | 24047344.07 | 27169738.59 |  |  |  |  | 28315324.51 |  |  | 41519758.01 |